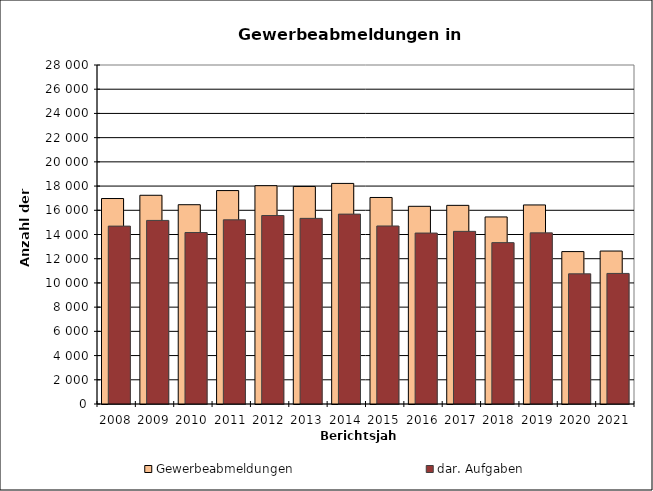
| Category | Gewerbeabmeldungen | dar. Aufgaben |
|---|---|---|
| 2008.0 | 16972 | 14693 |
| 2009.0 | 17240 | 15163 |
| 2010.0 | 16460 | 14163 |
| 2011.0 | 17629 | 15213 |
| 2012.0 | 18032 | 15567 |
| 2013.0 | 17968 | 15333 |
| 2014.0 | 18219 | 15684 |
| 2015.0 | 17058 | 14703 |
| 2016.0 | 16329 | 14120 |
| 2017.0 | 16407 | 14259 |
| 2018.0 | 15450 | 13328 |
| 2019.0 | 16441 | 14135 |
| 2020.0 | 12589 | 10752 |
| 2021.0 | 12634 | 10784 |